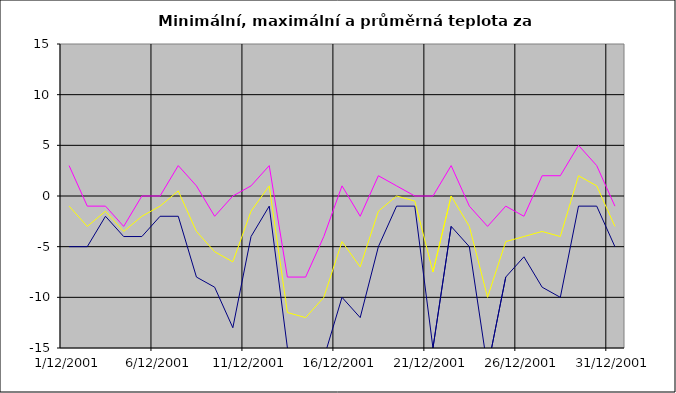
| Category | Series 0 | Series 1 | Series 2 |
|---|---|---|---|
| 2001-12-01 | -5 | 3 | -1 |
| 2001-12-02 | -5 | -1 | -3 |
| 2001-12-03 | -2 | -1 | -1.5 |
| 2001-12-04 | -4 | -3 | -3.5 |
| 2001-12-05 | -4 | 0 | -2 |
| 2001-12-06 | -2 | 0 | -1 |
| 2001-12-07 | -2 | 3 | 0.5 |
| 2001-12-08 | -8 | 1 | -3.5 |
| 2001-12-09 | -9 | -2 | -5.5 |
| 2001-12-10 | -13 | 0 | -6.5 |
| 2001-12-11 | -4 | 1 | -1.5 |
| 2001-12-12 | -1 | 3 | 1 |
| 2001-12-13 | -15 | -8 | -11.5 |
| 2001-12-14 | -16 | -8 | -12 |
| 2001-12-15 | -16 | -4 | -10 |
| 2001-12-16 | -10 | 1 | -4.5 |
| 2001-12-17 | -12 | -2 | -7 |
| 2001-12-18 | -5 | 2 | -1.5 |
| 2001-12-19 | -1 | 1 | 0 |
| 2001-12-20 | -1 | 0 | -0.5 |
| 2001-12-21 | -15 | 0 | -7.5 |
| 2001-12-22 | -3 | 3 | 0 |
| 2001-12-23 | -5 | -1 | -3 |
| 2001-12-24 | -17 | -3 | -10 |
| 2001-12-25 | -8 | -1 | -4.5 |
| 2001-12-26 | -6 | -2 | -4 |
| 2001-12-27 | -9 | 2 | -3.5 |
| 2001-12-28 | -10 | 2 | -4 |
| 2001-12-29 | -1 | 5 | 2 |
| 2001-12-30 | -1 | 3 | 1 |
| 2001-12-31 | -5 | -1 | -3 |